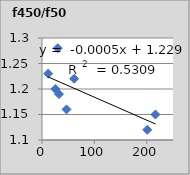
| Category | f450/f500 |
|---|---|
| 25.5 | 1.2 |
| 61.3 | 1.22 |
| 11.7 | 1.23 |
| 216.5 | 1.15 |
| 46.8 | 1.16 |
| 32.5 | 1.19 |
| 200.8 | 1.12 |
| 30.1 | 1.28 |